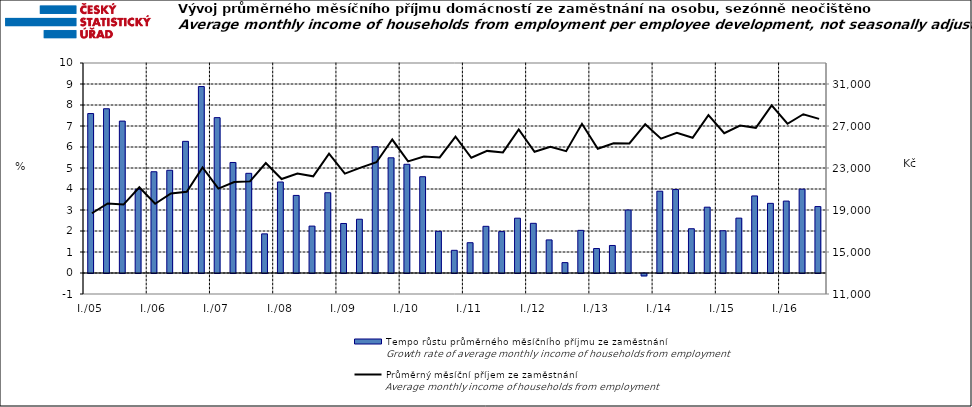
| Category | Tempo růstu průměrného měsíčního příjmu ze zaměstnání |
|---|---|
| I./05 | 7.592 |
|  | 7.822 |
|  | 7.233 |
|  | 3.981 |
| I./06 | 4.822 |
|  | 4.892 |
|  | 6.269 |
|  | 8.878 |
| I./07 | 7.399 |
|  | 5.263 |
|  | 4.746 |
|  | 1.864 |
| I./08 | 4.333 |
|  | 3.694 |
|  | 2.233 |
|  | 3.823 |
| I./09 | 2.357 |
|  | 2.56 |
|  | 6.011 |
|  | 5.485 |
| I./10 | 5.177 |
|  | 4.584 |
|  | 1.983 |
|  | 1.08 |
| I./11 | 1.442 |
|  | 2.223 |
|  | 1.972 |
|  | 2.61 |
| I./12 | 2.366 |
|  | 1.576 |
|  | 0.494 |
|  | 2.03 |
| I./13 | 1.165 |
|  | 1.311 |
|  | 3 |
|  | -0.114 |
| I./14 | 3.894 |
|  | 3.974 |
|  | 2.107 |
|  | 3.135 |
| I./15 | 2.011 |
|  | 2.613 |
|  | 3.67 |
|  | 3.317 |
| I./16 | 3.424 |